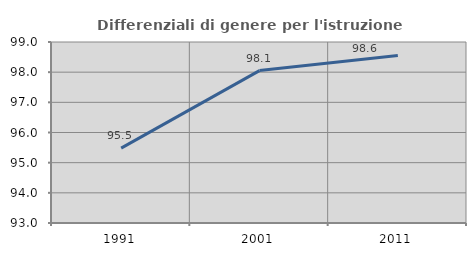
| Category | Differenziali di genere per l'istruzione superiore |
|---|---|
| 1991.0 | 95.481 |
| 2001.0 | 98.053 |
| 2011.0 | 98.556 |